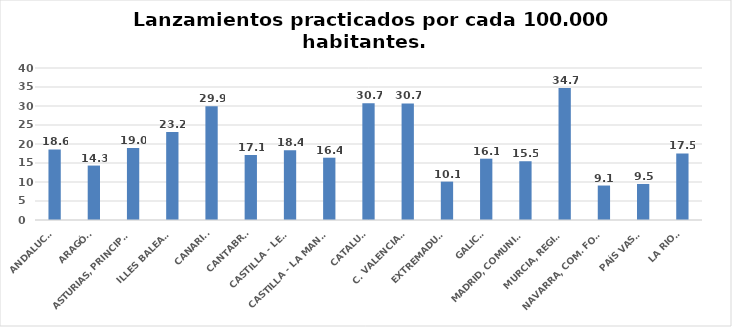
| Category | Series 0 |
|---|---|
| ANDALUCÍA | 18.583 |
| ARAGÓN | 14.326 |
| ASTURIAS, PRINCIPADO | 18.976 |
| ILLES BALEARS | 23.188 |
| CANARIAS | 29.913 |
| CANTABRIA | 17.108 |
| CASTILLA - LEÓN | 18.379 |
| CASTILLA - LA MANCHA | 16.394 |
| CATALUÑA | 30.734 |
| C. VALENCIANA | 30.683 |
| EXTREMADURA | 10.099 |
| GALICIA | 16.137 |
| MADRID, COMUNIDAD | 15.464 |
| MURCIA, REGIÓN | 34.706 |
| NAVARRA, COM. FORAL | 9.07 |
| PAÍS VASCO | 9.485 |
| LA RIOJA | 17.511 |